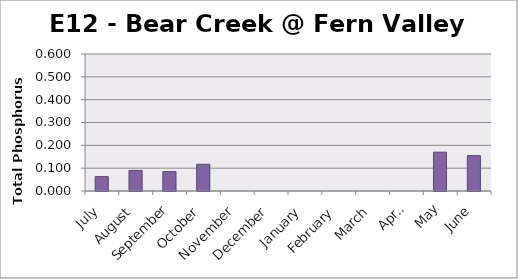
| Category | Phosphorus (mg/L) |
|---|---|
| July | 0.063 |
| August | 0.09 |
| September | 0.085 |
| October | 0.117 |
| November | 0 |
| December | 0 |
| January | 0 |
| February | 0 |
| March | 0 |
| April | 0 |
| May | 0.17 |
| June | 0.155 |